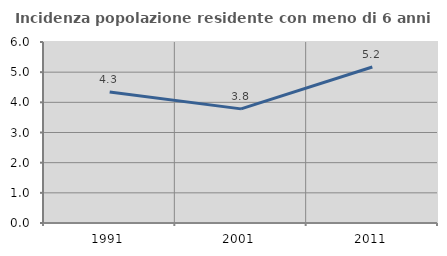
| Category | Incidenza popolazione residente con meno di 6 anni |
|---|---|
| 1991.0 | 4.342 |
| 2001.0 | 3.783 |
| 2011.0 | 5.172 |